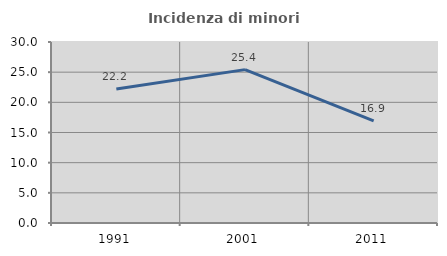
| Category | Incidenza di minori stranieri |
|---|---|
| 1991.0 | 22.222 |
| 2001.0 | 25.424 |
| 2011.0 | 16.912 |